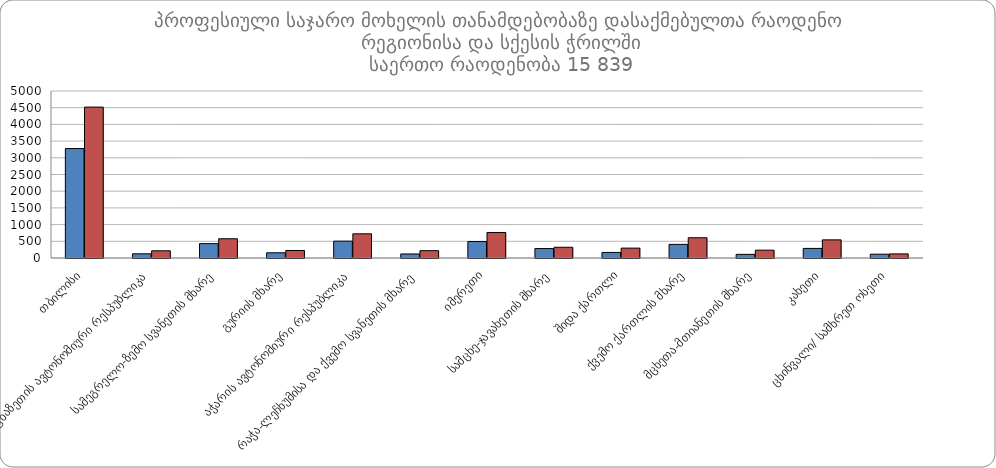
| Category | მამრობითი | მდედრობითი |
|---|---|---|
|  თბილისი | 3277 | 4518 |
|  აფხაზეთის ავტონომიური რესპუბლიკა | 125 | 216 |
|  სამეგრელო-ზემო სვანეთის მხარე | 430 | 576 |
|  გურიის მხარე | 156 | 225 |
|  აჭარის ავტონომიური რესპუბლიკა | 504 | 724 |
|  რაჭა-ლეჩხუმისა და ქვემო სვანეთის მხარე | 121 | 219 |
|  იმერეთი | 493 | 764 |
|  სამცხე-ჯავახეთის მხარე | 283 | 321 |
|  შიდა ქართლი | 167 | 296 |
|  ქვემო ქართლის მხარე | 408 | 606 |
|  მცხეთა-მთიანეთის მხარე | 109 | 234 |
|  კახეთი | 287 | 543 |
|  ცხინვალი/ სამხრეთ ოსეთი | 114 | 123 |